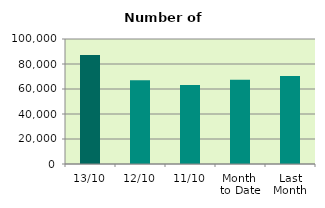
| Category | Series 0 |
|---|---|
| 13/10 | 87254 |
| 12/10 | 66994 |
| 11/10 | 63144 |
| Month 
to Date | 67449.111 |
| Last
Month | 70459.909 |